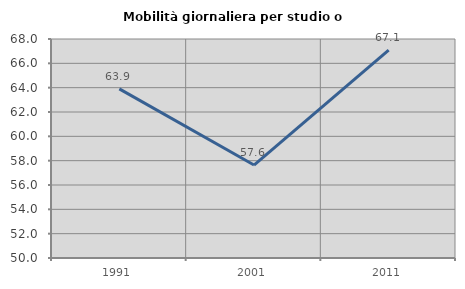
| Category | Mobilità giornaliera per studio o lavoro |
|---|---|
| 1991.0 | 63.9 |
| 2001.0 | 57.639 |
| 2011.0 | 67.092 |